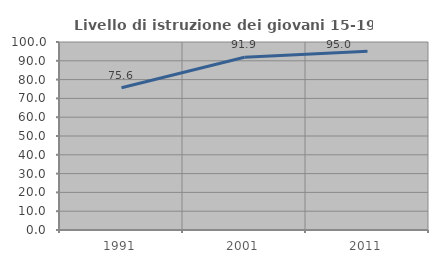
| Category | Livello di istruzione dei giovani 15-19 anni |
|---|---|
| 1991.0 | 75.643 |
| 2001.0 | 91.925 |
| 2011.0 | 95.016 |